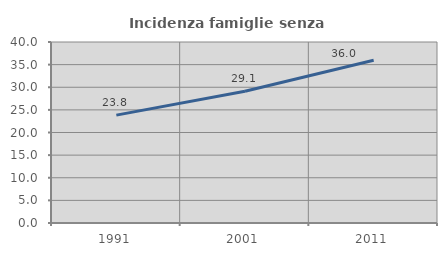
| Category | Incidenza famiglie senza nuclei |
|---|---|
| 1991.0 | 23.836 |
| 2001.0 | 29.1 |
| 2011.0 | 35.976 |